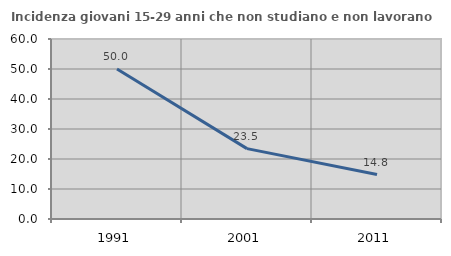
| Category | Incidenza giovani 15-29 anni che non studiano e non lavorano  |
|---|---|
| 1991.0 | 50 |
| 2001.0 | 23.457 |
| 2011.0 | 14.815 |